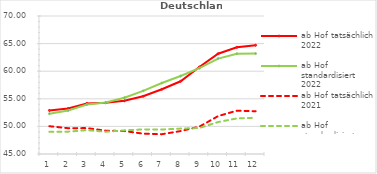
| Category | ab Hof tatsächlich 2022 | ab Hof standardisiert 2022 | ab Hof tatsächlich 2021 | ab Hof standardisiert 2021 |
|---|---|---|---|---|
| 0 | 52.893 | 52.303 | 50.037 | 49.015 |
| 1 | 53.251 | 52.882 | 49.674 | 49.047 |
| 2 | 54.162 | 53.961 | 49.692 | 49.322 |
| 3 | 54.295 | 54.343 | 49.231 | 49.03 |
| 4 | 54.64 | 55.203 | 49.154 | 49.283 |
| 5 | 55.46 | 56.435 | 48.687 | 49.457 |
| 6 | 56.727 | 57.859 | 48.59 | 49.436 |
| 7 | 58.175 | 59.123 | 49.154 | 49.605 |
| 8 | 60.754 | 60.553 | 49.955 | 49.71 |
| 9 | 63.173 | 62.287 | 51.869 | 50.79 |
| 10 | 64.319 | 63.17 | 52.851 | 51.445 |
| 11 | 64.702 | 63.2 | 52.749 | 51.571 |